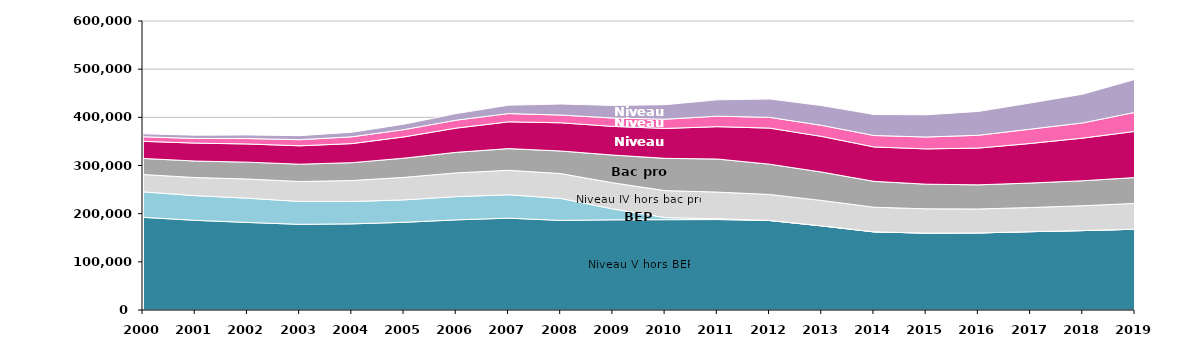
| Category | Niveau V hors BEP | BEP | Niveau IV hors Bac pro | Bac pro | Niveau III | Niveau II | Niveau I |
|---|---|---|---|---|---|---|---|
| 2000 | 192359 | 52974 | 35951 | 33404 | 35553 | 9448 | 6185 |
| 2001 | 186202 | 51244 | 37511 | 34317 | 37234 | 9568 | 6852 |
| 2002 | 181771 | 50395 | 39755 | 35047 | 37751 | 11243 | 7514 |
| 2003 | 177845 | 47490 | 41462 | 35900 | 38217 | 12674 | 8378 |
| 2004 | 178807 | 46467 | 43511 | 37112 | 39560 | 14124 | 9407 |
| 2005 | 182059 | 46554 | 46789 | 39820 | 44233 | 15063 | 11341 |
| 2006 | 187137 | 48254 | 49242 | 42709 | 50316 | 16461 | 13690 |
| 2007 | 190690 | 48604 | 50758 | 44995 | 55577 | 17198 | 17340 |
| 2008 | 186059 | 45600 | 51586 | 46884 | 58572 | 16021 | 22928 |
| 2009 | 187228 | 22539 | 54262 | 57638 | 59532 | 17387 | 26156 |
| 2010 | 187537 | 4320 | 55998 | 67020 | 62074 | 19189 | 30142 |
| 2011 | 187797 | 1763 | 55252 | 68636 | 67193 | 21762 | 33931 |
| 2012 | 185875 | 0 | 54022 | 62875 | 74868 | 22321 | 38182 |
| 2013 | 174654 | 0 | 52777 | 58905 | 74048 | 22937 | 41027 |
| 2014 | 162226 | 0 | 51183 | 53697 | 71419 | 23743 | 43614 |
| 2015 | 159610 | 0 | 50470 | 51112 | 73317 | 24655 | 46041 |
| 2016 | 159998 | 0 | 49741 | 50073 | 76326 | 26605 | 49523 |
| 2017 | 162650 | 0 | 50109 | 50843 | 82200 | 29740 | 54364 |
| 2018 | 164874 | 0 | 51594 | 51859 | 88551 | 31582 | 59667 |
| 2019 | 167702 | 0 | 53661 | 53594 | 95860 | 39506 | 68480 |